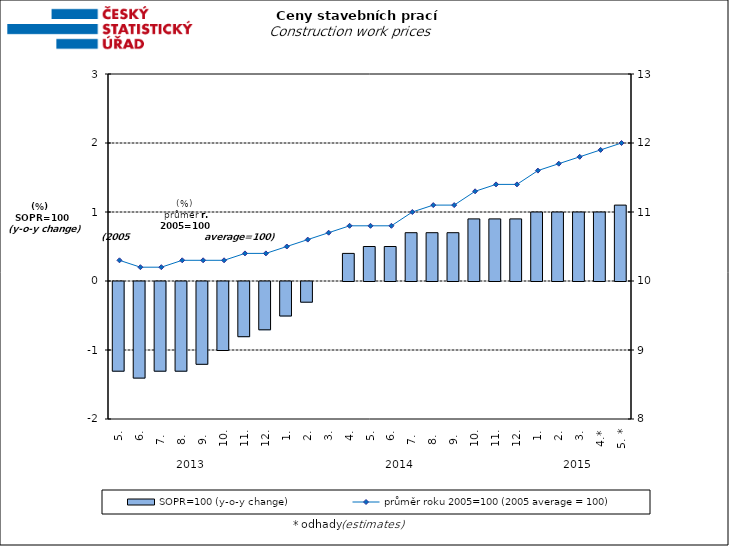
| Category | SOPR=100 (y-o-y change)   |
|---|---|
| 0 | -1.3 |
| 1 | -1.4 |
| 2 | -1.3 |
| 3 | -1.3 |
| 4 | -1.2 |
| 5 | -1 |
| 6 | -0.8 |
| 7 | -0.7 |
| 8 | -0.5 |
| 9 | -0.3 |
| 10 | 0 |
| 11 | 0.4 |
| 12 | 0.5 |
| 13 | 0.5 |
| 14 | 0.7 |
| 15 | 0.7 |
| 16 | 0.7 |
| 17 | 0.9 |
| 18 | 0.9 |
| 19 | 0.9 |
| 20 | 1 |
| 21 | 1 |
| 22 | 1 |
| 23 | 1 |
| 24 | 1.1 |